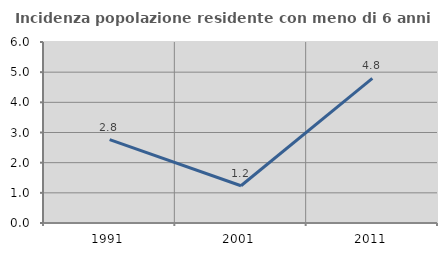
| Category | Incidenza popolazione residente con meno di 6 anni |
|---|---|
| 1991.0 | 2.765 |
| 2001.0 | 1.235 |
| 2011.0 | 4.795 |